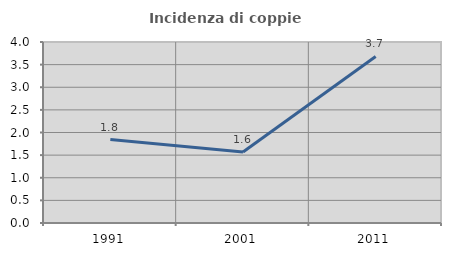
| Category | Incidenza di coppie miste |
|---|---|
| 1991.0 | 1.843 |
| 2001.0 | 1.571 |
| 2011.0 | 3.681 |